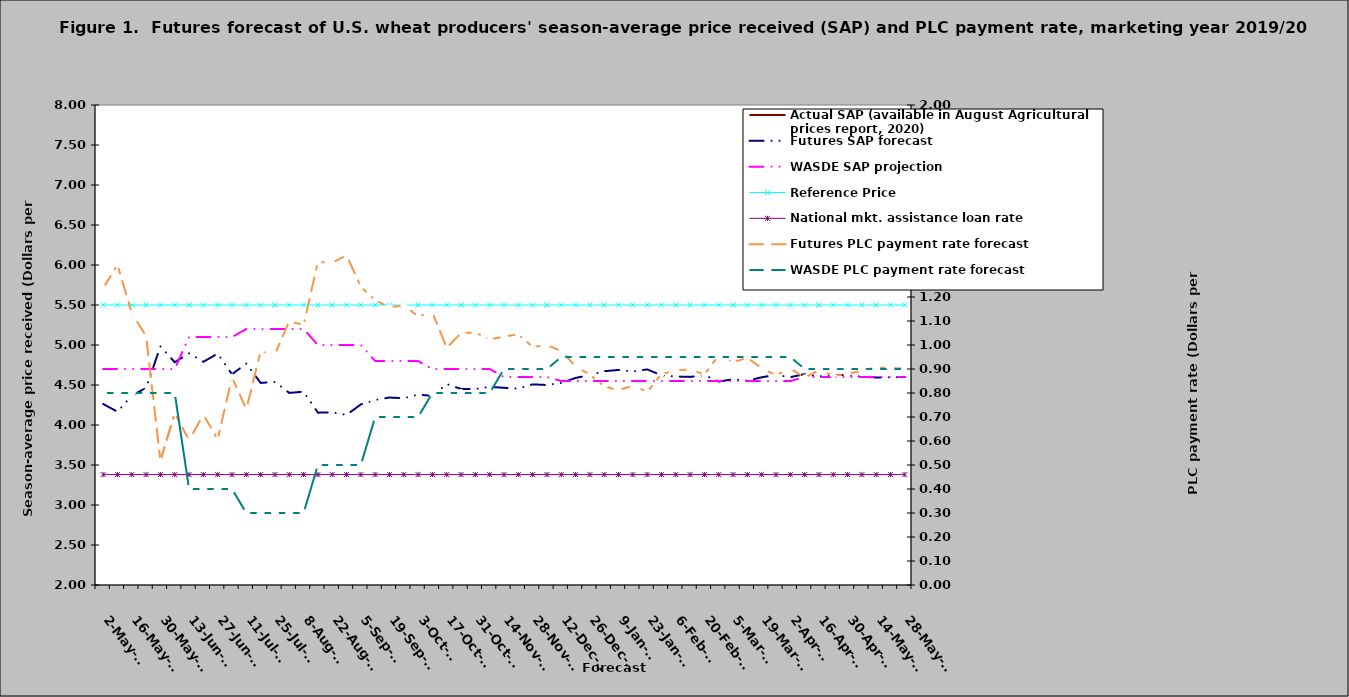
| Category | Actual SAP (available in August Agricultural prices report, 2020) | Futures SAP forecast | WASDE SAP projection | Reference Price | National mkt. assistance loan rate |
|---|---|---|---|---|---|
| 2019-05-02 |  | 4.263 | 4.7 | 5.5 | 3.38 |
| 2019-05-09 |  | 4.166 | 4.7 | 5.5 | 3.38 |
| 2019-05-16 |  | 4.368 | 4.7 | 5.5 | 3.38 |
| 2019-05-23 |  | 4.463 | 4.7 | 5.5 | 3.38 |
| 2019-05-30 |  | 4.982 | 4.7 | 5.5 | 3.38 |
| 2019-06-06 |  | 4.785 | 4.7 | 5.5 | 3.38 |
| 2019-06-13 |  | 4.896 | 5.1 | 5.5 | 3.38 |
| 2019-06-20 |  | 4.79 | 5.1 | 5.5 | 3.38 |
| 2019-06-27 |  | 4.893 | 5.1 | 5.5 | 3.38 |
| 2019-07-04 |  | 4.634 | 5.1 | 5.5 | 3.38 |
| 2019-07-11 |  | 4.768 | 5.2 | 5.5 | 3.38 |
| 2019-07-18 |  | 4.526 | 5.2 | 5.5 | 3.38 |
| 2019-07-25 |  | 4.538 | 5.2 | 5.5 | 3.38 |
| 2019-08-01 |  | 4.401 | 5.2 | 5.5 | 3.38 |
| 2019-08-08 |  | 4.417 | 5.2 | 5.5 | 3.38 |
| 2019-08-15 |  | 4.154 | 5 | 5.5 | 3.38 |
| 2019-08-22 |  | 4.157 | 5 | 5.5 | 3.38 |
| 2019-08-29 |  | 4.126 | 5 | 5.5 | 3.38 |
| 2019-09-05 |  | 4.258 | 5 | 5.5 | 3.38 |
| 2019-09-12 |  | 4.313 | 4.8 | 5.5 | 3.38 |
| 2019-09-19 |  | 4.343 | 4.8 | 5.5 | 3.38 |
| 2019-09-26 |  | 4.335 | 4.8 | 5.5 | 3.38 |
| 2019-10-03 |  | 4.38 | 4.8 | 5.5 | 3.38 |
| 2019-10-10 |  | 4.364 | 4.7 | 5.5 | 3.38 |
| 2019-10-17 |  | 4.512 | 4.7 | 5.5 | 3.38 |
| 2019-10-24 |  | 4.45 | 4.7 | 5.5 | 3.38 |
| 2019-10-31 |  | 4.448 | 4.7 | 5.5 | 3.38 |
| 2019-11-07 |  | 4.477 | 4.7 | 5.5 | 3.38 |
| 2019-11-14 |  | 4.465 | 4.6 | 5.5 | 3.38 |
| 2019-11-21 |  | 4.455 | 4.6 | 5.5 | 3.38 |
| 2019-11-28 |  | 4.508 | 4.6 | 5.5 | 3.38 |
| 2019-12-05 |  | 4.5 | 4.6 | 5.5 | 3.38 |
| 2019-12-12 |  | 4.525 | 4.55 | 5.5 | 3.38 |
| 2019-12-19 |  | 4.589 | 4.55 | 5.5 | 3.38 |
| 2019-12-26 |  | 4.624 | 4.55 | 5.5 | 3.38 |
| 2020-01-02 |  | 4.672 | 4.55 | 5.5 | 3.38 |
| 2020-01-09 |  | 4.688 | 4.55 | 5.5 | 3.38 |
| 2020-01-16 |  | 4.669 | 4.55 | 5.5 | 3.38 |
| 2020-01-23 |  | 4.695 | 4.55 | 5.5 | 3.38 |
| 2020-01-30 |  | 4.621 | 4.55 | 5.5 | 3.38 |
| 2020-02-06 |  | 4.606 | 4.55 | 5.5 | 3.38 |
| 2020-02-13 |  | 4.601 | 4.55 | 5.5 | 3.38 |
| 2020-02-20 |  | 4.623 | 4.55 | 5.5 | 3.38 |
| 2020-02-27 |  | 4.543 | 4.55 | 5.5 | 3.38 |
| 2020-03-05 |  | 4.572 | 4.55 | 5.5 | 3.38 |
| 2020-03-12 |  | 4.553 | 4.55 | 5.5 | 3.38 |
| 2020-03-19 |  | 4.596 | 4.55 | 5.5 | 3.38 |
| 2020-03-26 |  | 4.626 | 4.55 | 5.5 | 3.38 |
| 2020-04-02 |  | 4.598 | 4.55 | 5.5 | 3.38 |
| 2020-04-09 |  | 4.636 | 4.6 | 5.5 | 3.38 |
| 2020-04-16 |  | 4.606 | 4.6 | 5.5 | 3.38 |
| 2020-04-23 |  | 4.627 | 4.6 | 5.5 | 3.38 |
| 2020-04-30 |  | 4.622 | 4.6 | 5.5 | 3.38 |
| 2020-05-07 |  | 4.605 | 4.6 | 5.5 | 3.38 |
| 2020-05-14 |  | 4.594 | 4.6 | 5.5 | 3.38 |
| 2020-05-21 |  | 4.595 | 4.6 | 5.5 | 3.38 |
| 2020-05-28 |  | 4.598 | 4.6 | 5.5 | 3.38 |